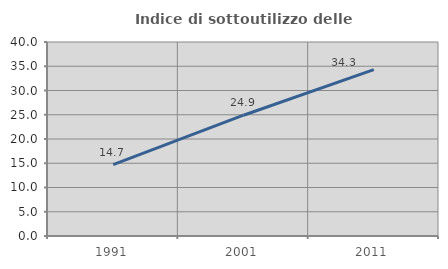
| Category | Indice di sottoutilizzo delle abitazioni  |
|---|---|
| 1991.0 | 14.724 |
| 2001.0 | 24.903 |
| 2011.0 | 34.306 |